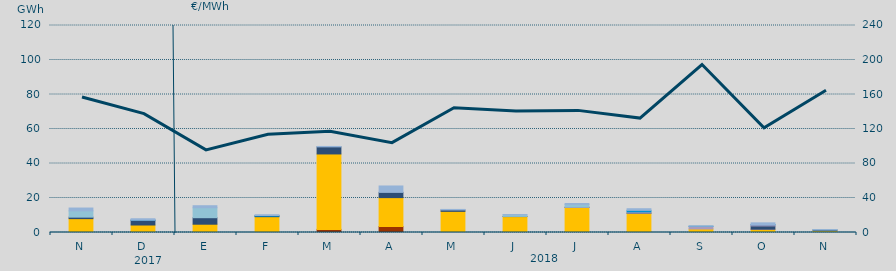
| Category | Carbón | Ciclo Combinado | Cogeneración | Consumo Bombeo | Enlace Península Baleares | Hidráulica | Internacionales | Turbinación bombeo |
|---|---|---|---|---|---|---|---|---|
| N | 0 | 8034.3 | 0 | 863.8 | 0 | 0 | 3635.7 | 1650.6 |
| D | 374 | 3967.2 | 0 | 2746.1 | 58.6 | 52.1 | 0 | 774.9 |
| E | 0 | 4799.8 | 0 | 3776.1 | 0 | 0 | 5766.5 | 1181.9 |
| F | 0 | 9167.2 | 0 | 319.8 | 0 | 367.5 | 0 | 436 |
| M | 1806.7 | 43724.8 | 0 | 4108.1 | 0 | 0 | 0 | 249 |
| A | 3485.4 | 16735.1 | 0 | 3030.8 | 0 | 0 | 0 | 3717.6 |
| M | 0 | 12256.8 | 0 | 795.1 | 0 | 0 | 0 | 330.9 |
| J | 0 | 9234.9 | 0 | 91.5 | 0 | 0 | 976 | 107.7 |
| J | 92.3 | 14456.3 | 0 | 14.6 | 244 | 0 | 1458.3 | 560.7 |
| A | 291.3 | 10832 | 0 | 140.5 | 678 | 898.1 | 0 | 948.3 |
| S | 0 | 2035.7 | 0 | 0 | 1565.3 | 5 | 0 | 107.3 |
| O | 0 | 1903.4 | 7.4 | 1893.5 | 711 | 97 | 0 | 979 |
| N | 0 | 1082.6 | 0 | 481.8 | 0 | 0 | 2.8 | 84 |